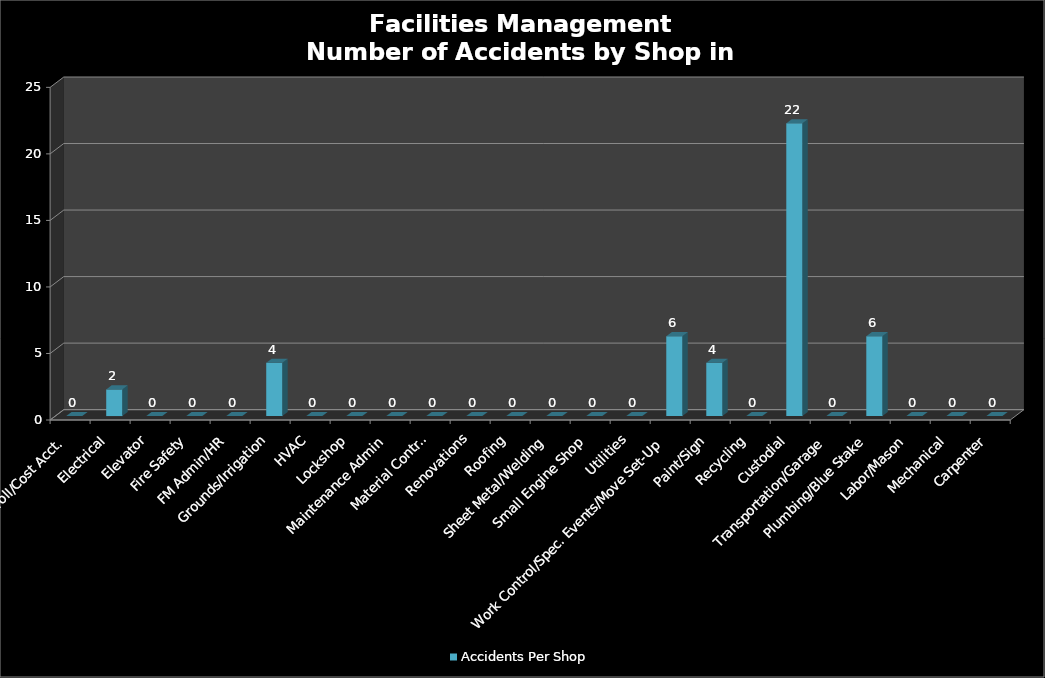
| Category | Accidents Per Shop |
|---|---|
| Bus Serv/IT/Payroll/Cost Acct. | 0 |
| Electrical | 2 |
| Elevator | 0 |
| Fire Safety | 0 |
| FM Admin/HR | 0 |
| Grounds/Irrigation | 4 |
| HVAC | 0 |
| Lockshop | 0 |
| Maintenance Admin | 0 |
| Material Control | 0 |
| Renovations | 0 |
| Roofing | 0 |
| Sheet Metal/Welding | 0 |
| Small Engine Shop | 0 |
| Utilities | 0 |
| Work Control/Spec. Events/Move Set-Up | 6 |
| Paint/Sign | 4 |
| Recycling | 0 |
| Custodial | 22 |
| Transportation/Garage | 0 |
| Plumbing/Blue Stake | 6 |
| Labor/Mason | 0 |
| Mechanical | 0 |
| Carpenter | 0 |